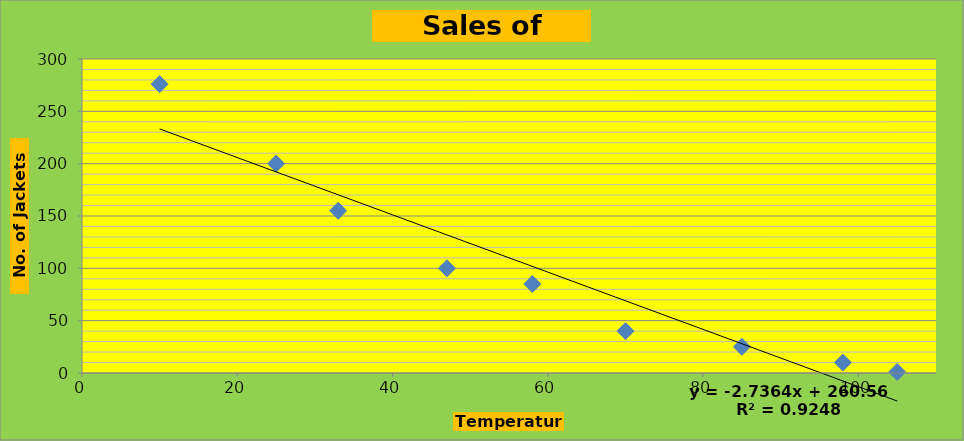
| Category | Sales of Jackets |
|---|---|
| 10.0 | 276 |
| 25.0 | 200 |
| 33.0 | 155 |
| 47.0 | 100 |
| 58.0 | 85 |
| 70.0 | 40 |
| 85.0 | 25 |
| 98.0 | 10 |
| 105.0 | 1 |